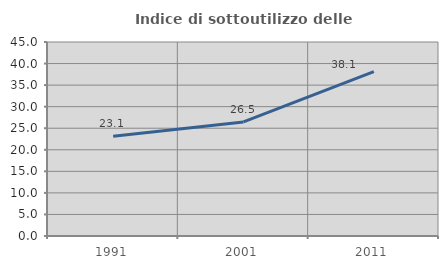
| Category | Indice di sottoutilizzo delle abitazioni  |
|---|---|
| 1991.0 | 23.148 |
| 2001.0 | 26.454 |
| 2011.0 | 38.125 |